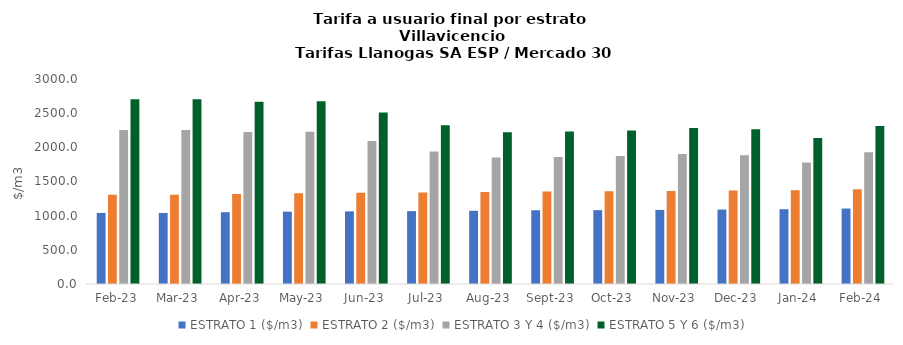
| Category | ESTRATO 1 ($/m3) | ESTRATO 2 ($/m3) | ESTRATO 3 Y 4 ($/m3) | ESTRATO 5 Y 6 ($/m3) |
|---|---|---|---|---|
| 2023-02-01 | 1039.76 | 1304.76 | 2251.92 | 2702.304 |
| 2023-03-01 | 1039.76 | 1304.76 | 2251.92 | 2702.304 |
| 2023-04-01 | 1050.8 | 1318.62 | 2223.64 | 2668.368 |
| 2023-05-01 | 1058.67 | 1328.49 | 2227.49 | 2672.988 |
| 2023-06-01 | 1063.04 | 1333.97 | 2092.35 | 2510.82 |
| 2023-07-01 | 1066.3 | 1338.06 | 1937.39 | 2324.868 |
| 2023-08-01 | 1071.54 | 1344.64 | 1852.08 | 2222.496 |
| 2023-09-01 | 1079.09 | 1354.11 | 1858.9 | 2230.68 |
| 2023-10-01 | 1081.39 | 1357 | 1871.96 | 2246.352 |
| 2023-11-01 | 1084.09 | 1360.39 | 1903.33 | 2283.996 |
| 2023-12-01 | 1089.17 | 1366.77 | 1885.93 | 2263.116 |
| 2024-01-01 | 1094.18 | 1373.05 | 1779.87 | 2135.844 |
| 2024-02-01 | 1104.19 | 1385.61 | 1926.98 | 2312.376 |